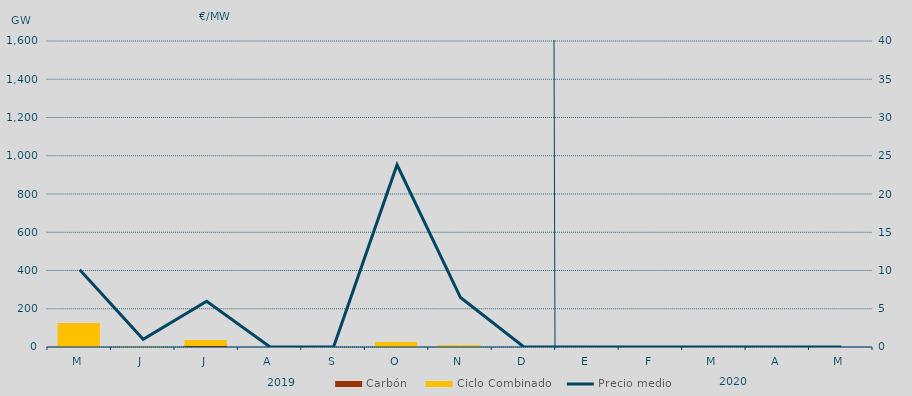
| Category | Carbón | Ciclo Combinado |
|---|---|---|
| M | 5017.5 | 120808.3 |
| J | 0 | 4200 |
| J | 10582.1 | 26246.2 |
| A | 0 | 0 |
| S | 0 | 0 |
| O | 0 | 25712.6 |
| N | 0 | 8552.1 |
| D | 0 | 0 |
| E | 0 | 0 |
| F | 0 | 0 |
| M | 0 | 0 |
| A | 0 | 0 |
| M | 0 | 0 |